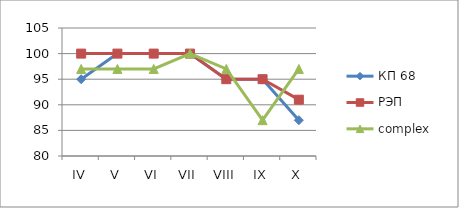
| Category | КП 68 | РЭП  | complex |
|---|---|---|---|
| IV | 95 | 100 | 97 |
| V | 100 | 100 | 97 |
| VI | 100 | 100 | 97 |
| VII | 100 | 100 | 100 |
| VIII | 95 | 95 | 97 |
| IX | 95 | 95 | 87 |
| X | 87 | 91 | 97 |